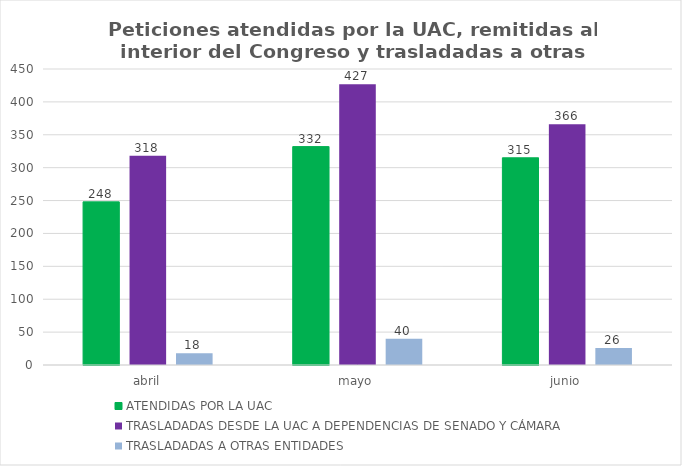
| Category | ATENDIDAS POR LA UAC  | TRASLADADAS DESDE LA UAC A DEPENDENCIAS DE SENADO Y CÁMARA | TRASLADADAS A OTRAS ENTIDADES |
|---|---|---|---|
| abril | 248 | 318 | 18 |
| mayo | 332 | 427 | 40 |
| junio | 315 | 366 | 26 |